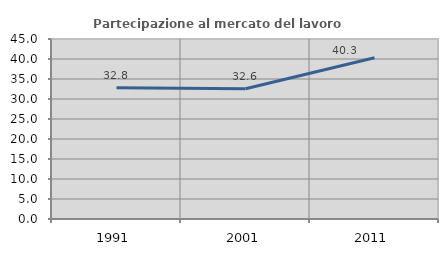
| Category | Partecipazione al mercato del lavoro  femminile |
|---|---|
| 1991.0 | 32.781 |
| 2001.0 | 32.576 |
| 2011.0 | 40.316 |